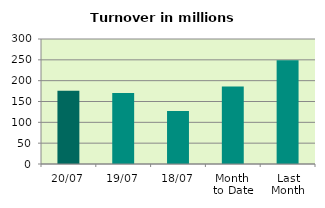
| Category | Series 0 |
|---|---|
| 20/07 | 175.779 |
| 19/07 | 170.617 |
| 18/07 | 127.149 |
| Month 
to Date | 186.17 |
| Last
Month | 248.976 |